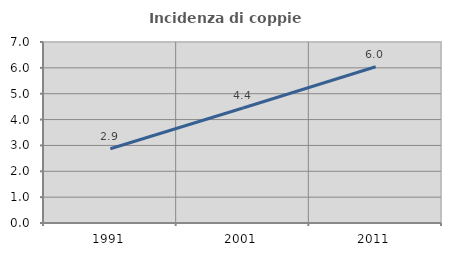
| Category | Incidenza di coppie miste |
|---|---|
| 1991.0 | 2.87 |
| 2001.0 | 4.446 |
| 2011.0 | 6.043 |